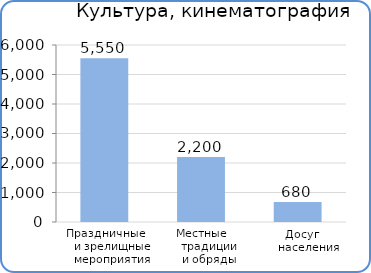
| Category | Расходы |
|---|---|
| Праздничные и зрелищные мероприятия | 5550000 |
| Местные традиции и обряды | 2200000 |
| Досуг населения | 679700 |